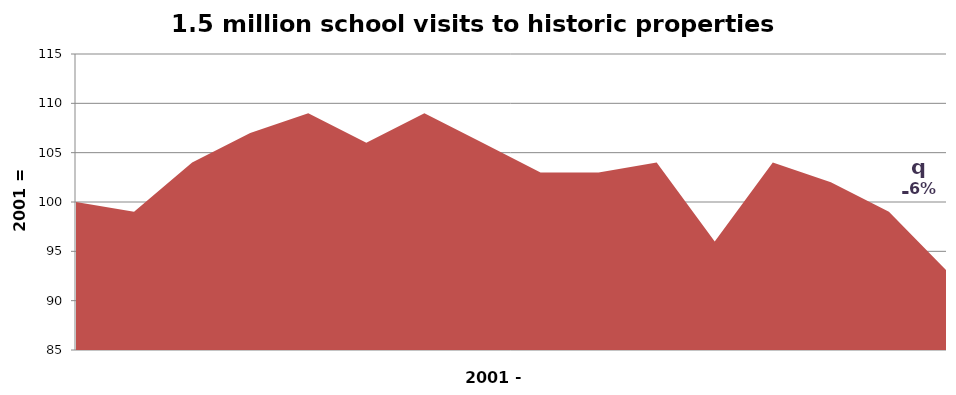
| Category | (2001=100)  |
|---|---|
| 0 | 100 |
| 1 | 99 |
| 2 | 104 |
| 3 | 107 |
| 4 | 109 |
| 5 | 106 |
| 6 | 109 |
| 7 | 106 |
| 8 | 103 |
| 9 | 103 |
| 10 | 104 |
| 11 | 96 |
| 12 | 104 |
| 13 | 102 |
| 14 | 99 |
| 15 | 93 |